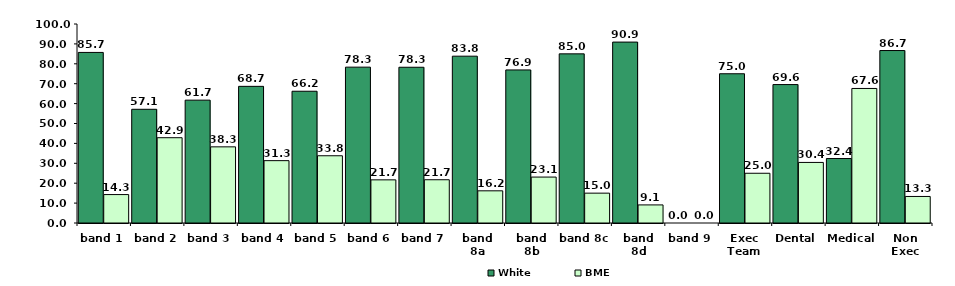
| Category | White | BME |
|---|---|---|
| band 1 | 85.714 | 14.286 |
| band 2 | 57.143 | 42.857 |
| band 3 | 61.734 | 38.266 |
| band 4 | 68.668 | 31.332 |
| band 5 | 66.208 | 33.792 |
| band 6 | 78.315 | 21.685 |
| band 7 | 78.261 | 21.739 |
| band 8a | 83.832 | 16.168 |
| band 8b | 76.923 | 23.077 |
| band 8c | 85 | 15 |
| band 8d | 90.909 | 9.091 |
| band 9 | 0 | 0 |
| Exec Team | 75 | 25 |
| Dental | 69.565 | 30.435 |
| Medical | 32.394 | 67.606 |
| Non Exec | 86.667 | 13.333 |